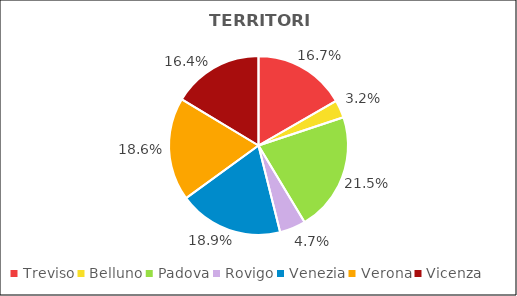
| Category | Series 0 |
|---|---|
| Treviso | 19517 |
| Belluno | 3732 |
| Padova | 25121 |
| Rovigo | 5515 |
| Venezia | 22072 |
| Verona | 21784 |
| Vicenza | 19127 |